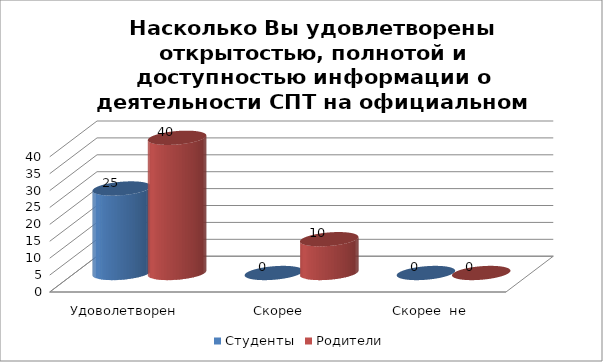
| Category | Студенты | Родители |
|---|---|---|
| Удоволетворен | 25 | 40 |
| Скорее удовлетворен | 0 | 10 |
| Скорее  не удовлетворен | 0 | 0 |